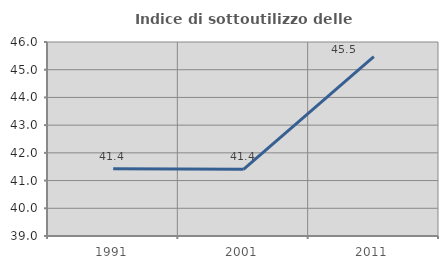
| Category | Indice di sottoutilizzo delle abitazioni  |
|---|---|
| 1991.0 | 41.426 |
| 2001.0 | 41.406 |
| 2011.0 | 45.476 |